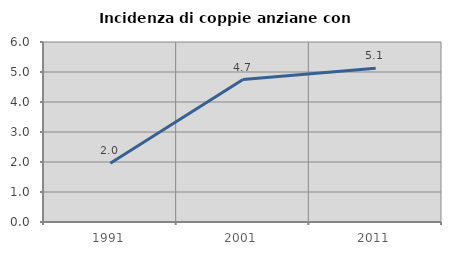
| Category | Incidenza di coppie anziane con figli |
|---|---|
| 1991.0 | 1.961 |
| 2001.0 | 4.748 |
| 2011.0 | 5.122 |